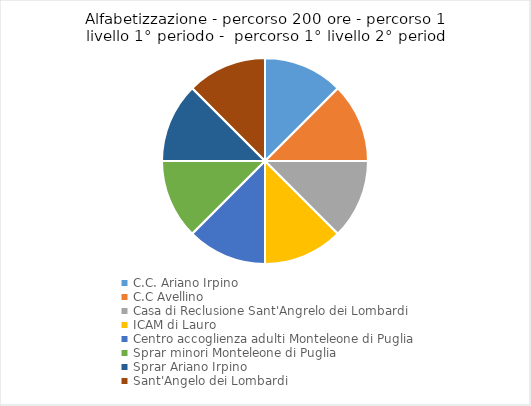
| Category | Series 0 |
|---|---|
| C.C. Ariano Irpino | 1 |
| C.C Avellino | 1 |
| Casa di Reclusione Sant'Angrelo dei Lombardi | 1 |
| ICAM di Lauro | 1 |
| Centro accoglienza adulti Monteleone di Puglia | 1 |
| Sprar minori Monteleone di Puglia | 1 |
| Sprar Ariano Irpino | 1 |
| Sant'Angelo dei Lombardi | 1 |